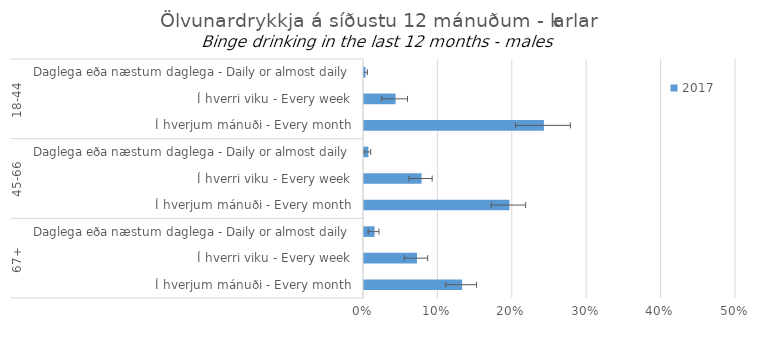
| Category | 2017 |
|---|---|
| 0 | 0.002 |
| 1 | 0.042 |
| 2 | 0.242 |
| 3 | 0.006 |
| 4 | 0.077 |
| 5 | 0.195 |
| 6 | 0.014 |
| 7 | 0.071 |
| 8 | 0.132 |